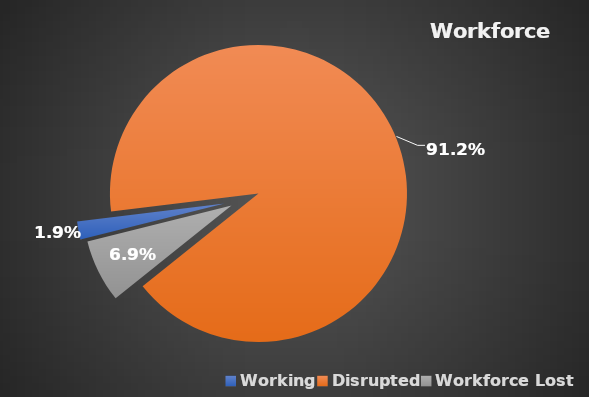
| Category | Series 2 |
|---|---|
| 0 | 0.019 |
| 1 | 0.912 |
| 2 | 0.069 |